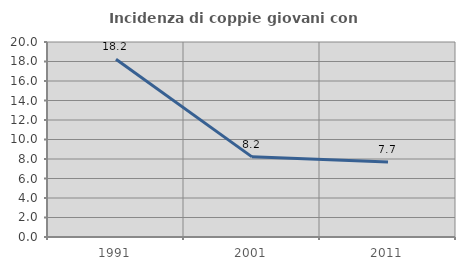
| Category | Incidenza di coppie giovani con figli |
|---|---|
| 1991.0 | 18.239 |
| 2001.0 | 8.219 |
| 2011.0 | 7.692 |